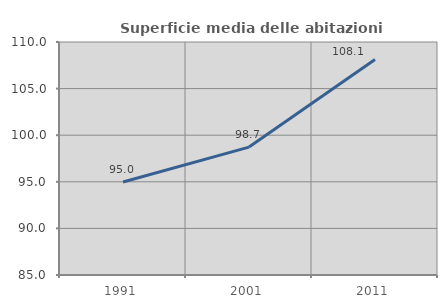
| Category | Superficie media delle abitazioni occupate |
|---|---|
| 1991.0 | 94.976 |
| 2001.0 | 98.726 |
| 2011.0 | 108.112 |